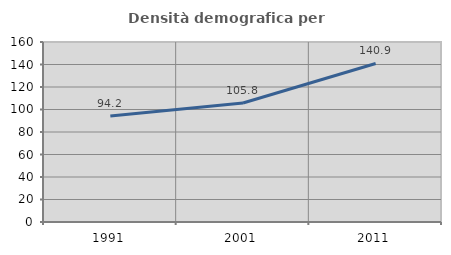
| Category | Densità demografica |
|---|---|
| 1991.0 | 94.246 |
| 2001.0 | 105.796 |
| 2011.0 | 140.908 |